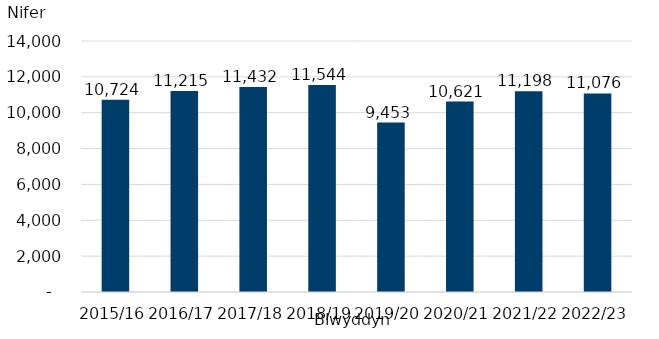
| Category | Nifer y plant sy'n mynychu'r Cylchoedd Meithrin |
|---|---|
| 2015/16 | 10724 |
| 2016/17 | 11215 |
| 2017/18 | 11432 |
| 2018/19 | 11544 |
| 2019/20 | 9453 |
| 2020/21 | 10621 |
| 2021/22 | 11198 |
| 2022/23 | 11076 |